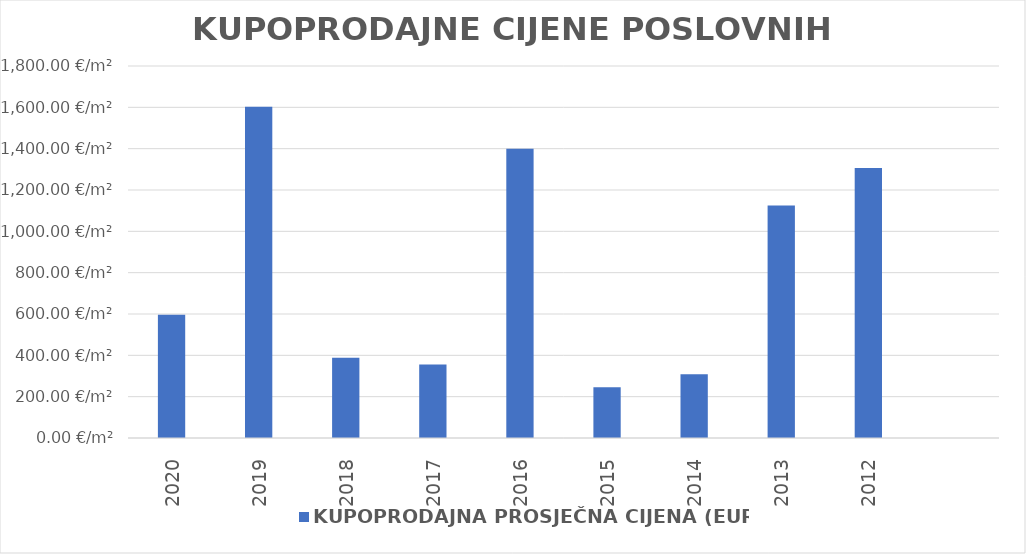
| Category | KUPOPRODAJNA PROSJEČNA CIJENA (EUR/m²) |
|---|---|
| 2020 | 1901-08-18 15:54:58 |
| 2019 | 1904-05-20 14:54:50 |
| 2018 | 1901-01-22 21:41:16 |
| 2017 | 1900-12-20 12:15:54 |
| 2016 | 1903-10-30 11:40:06 |
| 2015 | 1900-09-01 16:24:28 |
| 2014 | 1900-11-03 12:53:39 |
| 2013 | 1903-01-29 05:42:15 |
| 2012 | 1903-07-29 22:20:32 |